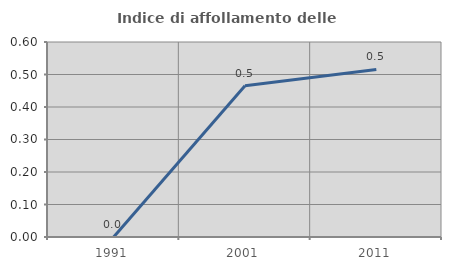
| Category | Indice di affollamento delle abitazioni  |
|---|---|
| 1991.0 | 0 |
| 2001.0 | 0.465 |
| 2011.0 | 0.515 |